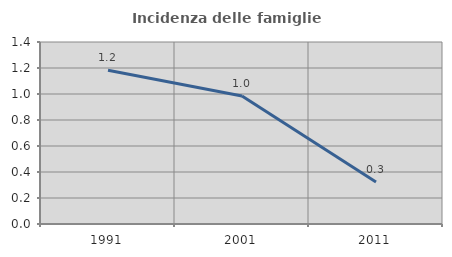
| Category | Incidenza delle famiglie numerose |
|---|---|
| 1991.0 | 1.182 |
| 2001.0 | 0.985 |
| 2011.0 | 0.324 |